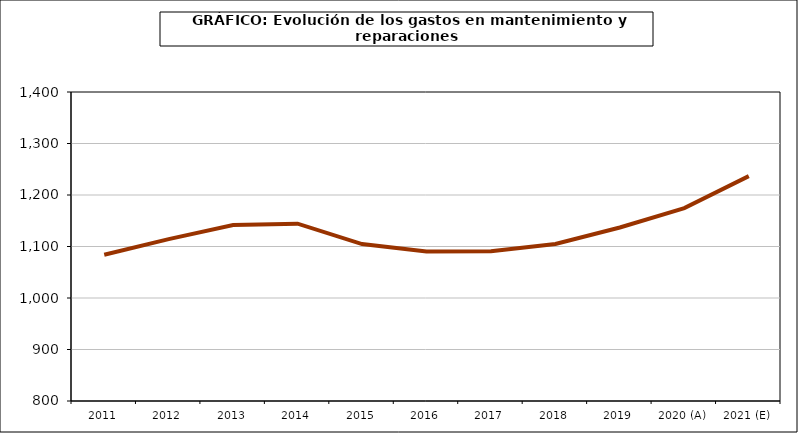
| Category | Series 0 |
|---|---|
| 2011 | 1083.98 |
| 2012 | 1114.377 |
| 2013 | 1141.575 |
| 2014 | 1144.341 |
| 2015 | 1104.719 |
| 2016 | 1090.39 |
| 2017 | 1090.889 |
| 2018 | 1104.884 |
| 2019 | 1136.967 |
| 2020 (A) | 1174.579 |
| 2021 (E) | 1236.73 |